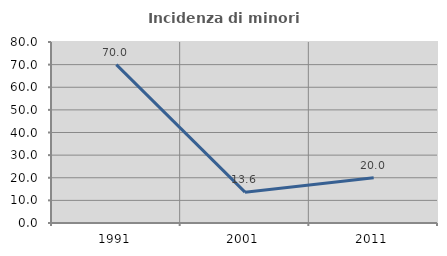
| Category | Incidenza di minori stranieri |
|---|---|
| 1991.0 | 70 |
| 2001.0 | 13.636 |
| 2011.0 | 20 |